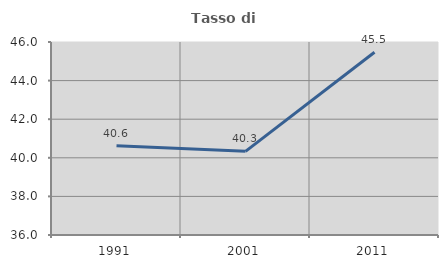
| Category | Tasso di occupazione   |
|---|---|
| 1991.0 | 40.631 |
| 2001.0 | 40.333 |
| 2011.0 | 45.472 |